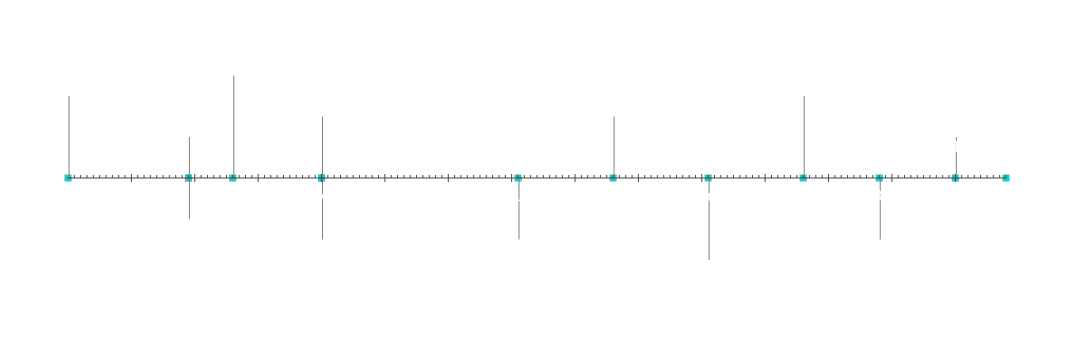
| Category | Position |
|---|---|
| Project Start | 20 |
| Milestone 1 | 10 |
| Milestone 2 | -10 |
| Milestone 3 | 25 |
| Milestone 4 | -15 |
| Milestone 5 | 15 |
| Milestone 6 | -15 |
| Milestone 7 | 15 |
| Milestone 8 | -20 |
| Milestone 9 | 20 |
| Milestone 10 | -15 |
| Milestone 11 | 10 |
| Project End | 5 |